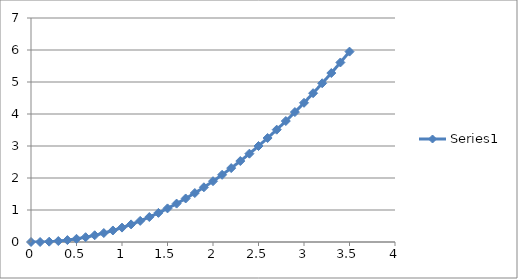
| Category | Series 0 |
|---|---|
| 0.0 | 0 |
| 0.1 | 0 |
| 0.2 | 0.01 |
| 0.30000000000000004 | 0.03 |
| 0.4 | 0.06 |
| 0.5 | 0.1 |
| 0.6 | 0.15 |
| 0.7 | 0.21 |
| 0.7999999999999999 | 0.28 |
| 0.8999999999999999 | 0.36 |
| 0.9999999999999999 | 0.45 |
| 1.0999999999999999 | 0.55 |
| 1.2 | 0.66 |
| 1.3 | 0.78 |
| 1.4000000000000001 | 0.91 |
| 1.5000000000000002 | 1.05 |
| 1.6000000000000003 | 1.2 |
| 1.7000000000000004 | 1.36 |
| 1.8000000000000005 | 1.53 |
| 1.9000000000000006 | 1.71 |
| 2.0000000000000004 | 1.9 |
| 2.1000000000000005 | 2.1 |
| 2.2000000000000006 | 2.31 |
| 2.3000000000000007 | 2.53 |
| 2.400000000000001 | 2.76 |
| 2.500000000000001 | 3 |
| 2.600000000000001 | 3.25 |
| 2.700000000000001 | 3.51 |
| 2.800000000000001 | 3.78 |
| 2.9000000000000012 | 4.06 |
| 3.0000000000000013 | 4.35 |
| 3.1000000000000014 | 4.65 |
| 3.2000000000000015 | 4.96 |
| 3.3000000000000016 | 5.28 |
| 3.4000000000000017 | 5.61 |
| 3.5000000000000018 | 5.95 |